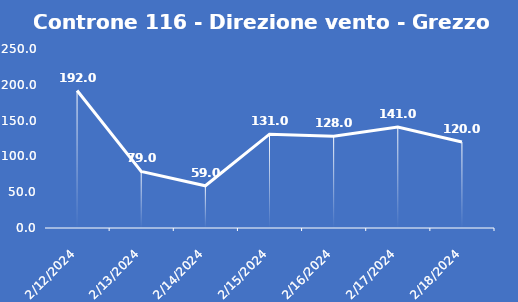
| Category | Controne 116 - Direzione vento - Grezzo (°N) |
|---|---|
| 2/12/24 | 192 |
| 2/13/24 | 79 |
| 2/14/24 | 59 |
| 2/15/24 | 131 |
| 2/16/24 | 128 |
| 2/17/24 | 141 |
| 2/18/24 | 120 |